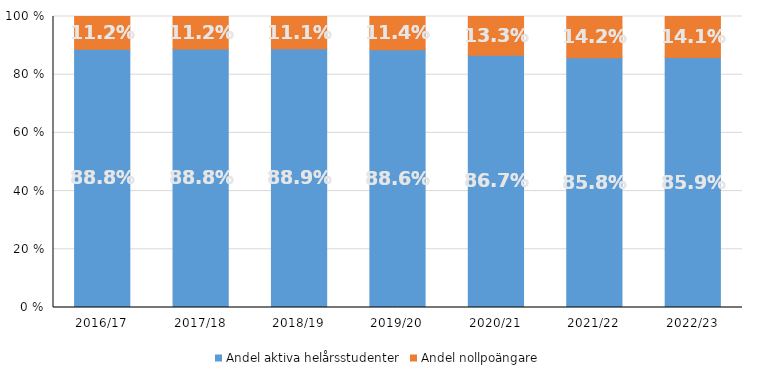
| Category | Andel aktiva helårsstudenter | Andel nollpoängare |
|---|---|---|
| 2016/17 | 0.888 | 0.112 |
| 2017/18 | 0.888 | 0.112 |
| 2018/19 | 0.889 | 0.111 |
| 2019/20 | 0.886 | 0.114 |
| 2020/21 | 0.867 | 0.133 |
| 2021/22 | 0.858 | 0.142 |
| 2022/23 | 0.859 | 0.141 |